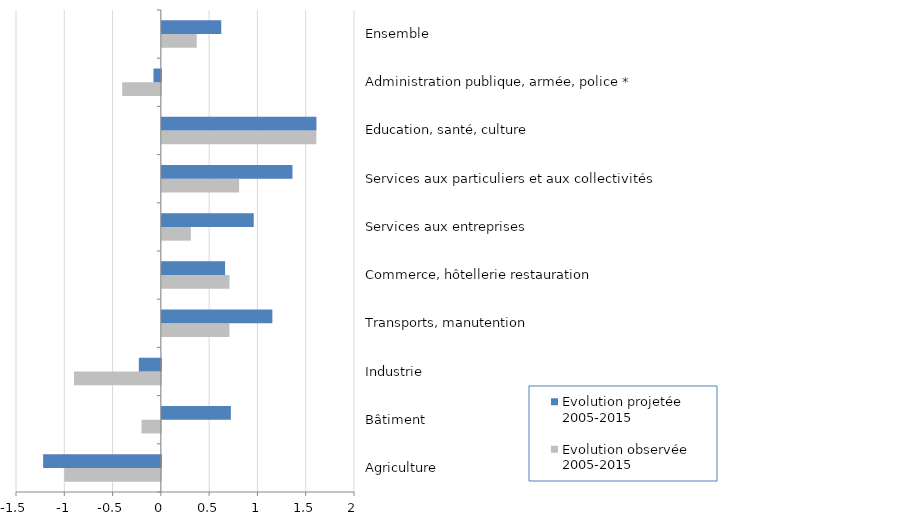
| Category | Evolution observée 2005-2015 | Evolution projetée 2005-2015 |
|---|---|---|
| Agriculture | -1 | -1.219 |
| Bâtiment | -0.2 | 0.715 |
| Industrie | -0.9 | -0.228 |
| Transports, manutention | 0.7 | 1.144 |
| Commerce, hôtellerie restauration | 0.7 | 0.655 |
| Services aux entreprises | 0.3 | 0.951 |
| Services aux particuliers et aux collectivités | 0.8 | 1.352 |
| Education, santé, culture | 1.6 | 1.601 |
| Administration publique, armée, police * | -0.4 | -0.076 |
| Ensemble  | 0.361 | 0.615 |